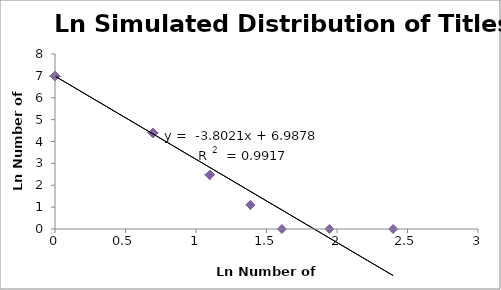
| Category | LnSimulated Number of Athletes |
|---|---|
| 2.3978952727983707 | 0 |
| 1.9459101490553132 | 0 |
| 1.6094379124341003 | 0 |
| 1.3862943611198906 | 1.099 |
| 1.3862943611198906 | 1.099 |
| 1.3862943611198906 | 1.099 |
| 1.0986122886681098 | 2.485 |
| 1.0986122886681098 | 2.485 |
| 1.0986122886681098 | 2.485 |
| 1.0986122886681098 | 2.485 |
| 1.0986122886681098 | 2.485 |
| 1.0986122886681098 | 2.485 |
| 1.0986122886681098 | 2.485 |
| 1.0986122886681098 | 2.485 |
| 1.0986122886681098 | 2.485 |
| 1.0986122886681098 | 2.485 |
| 1.0986122886681098 | 2.485 |
| 1.0986122886681098 | 2.485 |
| 0.6931471805599453 | 4.394 |
| 0.6931471805599453 | 4.394 |
| 0.6931471805599453 | 4.394 |
| 0.6931471805599453 | 4.394 |
| 0.6931471805599453 | 4.394 |
| 0.6931471805599453 | 4.394 |
| 0.6931471805599453 | 4.394 |
| 0.6931471805599453 | 4.394 |
| 0.6931471805599453 | 4.394 |
| 0.6931471805599453 | 4.394 |
| 0.6931471805599453 | 4.394 |
| 0.6931471805599453 | 4.394 |
| 0.6931471805599453 | 4.394 |
| 0.6931471805599453 | 4.394 |
| 0.6931471805599453 | 4.394 |
| 0.6931471805599453 | 4.394 |
| 0.6931471805599453 | 4.394 |
| 0.6931471805599453 | 4.394 |
| 0.6931471805599453 | 4.394 |
| 0.6931471805599453 | 4.394 |
| 0.6931471805599453 | 4.394 |
| 0.6931471805599453 | 4.394 |
| 0.6931471805599453 | 4.394 |
| 0.6931471805599453 | 4.394 |
| 0.6931471805599453 | 4.394 |
| 0.6931471805599453 | 4.394 |
| 0.6931471805599453 | 4.394 |
| 0.6931471805599453 | 4.394 |
| 0.6931471805599453 | 4.394 |
| 0.6931471805599453 | 4.394 |
| 0.6931471805599453 | 4.394 |
| 0.6931471805599453 | 4.394 |
| 0.6931471805599453 | 4.394 |
| 0.6931471805599453 | 4.394 |
| 0.6931471805599453 | 4.394 |
| 0.6931471805599453 | 4.394 |
| 0.6931471805599453 | 4.394 |
| 0.6931471805599453 | 4.394 |
| 0.6931471805599453 | 4.394 |
| 0.6931471805599453 | 4.394 |
| 0.6931471805599453 | 4.394 |
| 0.6931471805599453 | 4.394 |
| 0.6931471805599453 | 4.394 |
| 0.6931471805599453 | 4.394 |
| 0.6931471805599453 | 4.394 |
| 0.6931471805599453 | 4.394 |
| 0.6931471805599453 | 4.394 |
| 0.6931471805599453 | 4.394 |
| 0.6931471805599453 | 4.394 |
| 0.6931471805599453 | 4.394 |
| 0.6931471805599453 | 4.394 |
| 0.6931471805599453 | 4.394 |
| 0.6931471805599453 | 4.394 |
| 0.6931471805599453 | 4.394 |
| 0.6931471805599453 | 4.394 |
| 0.6931471805599453 | 4.394 |
| 0.6931471805599453 | 4.394 |
| 0.6931471805599453 | 4.394 |
| 0.6931471805599453 | 4.394 |
| 0.6931471805599453 | 4.394 |
| 0.6931471805599453 | 4.394 |
| 0.6931471805599453 | 4.394 |
| 0.6931471805599453 | 4.394 |
| 0.6931471805599453 | 4.394 |
| 0.6931471805599453 | 4.394 |
| 0.6931471805599453 | 4.394 |
| 0.6931471805599453 | 4.394 |
| 0.6931471805599453 | 4.394 |
| 0.6931471805599453 | 4.394 |
| 0.6931471805599453 | 4.394 |
| 0.6931471805599453 | 4.394 |
| 0.6931471805599453 | 4.394 |
| 0.6931471805599453 | 4.394 |
| 0.6931471805599453 | 4.394 |
| 0.6931471805599453 | 4.394 |
| 0.6931471805599453 | 4.394 |
| 0.6931471805599453 | 4.394 |
| 0.6931471805599453 | 4.394 |
| 0.6931471805599453 | 4.394 |
| 0.6931471805599453 | 4.394 |
| 0.6931471805599453 | 4.394 |
| 0.0 | 6.988 |
| 0.0 | 6.988 |
| 0.0 | 6.988 |
| 0.0 | 6.988 |
| 0.0 | 6.988 |
| 0.0 | 6.988 |
| 0.0 | 6.988 |
| 0.0 | 6.988 |
| 0.0 | 6.988 |
| 0.0 | 6.988 |
| 0.0 | 6.988 |
| 0.0 | 6.988 |
| 0.0 | 6.988 |
| 0.0 | 6.988 |
| 0.0 | 6.988 |
| 0.0 | 6.988 |
| 0.0 | 6.988 |
| 0.0 | 6.988 |
| 0.0 | 6.988 |
| 0.0 | 6.988 |
| 0.0 | 6.988 |
| 0.0 | 6.988 |
| 0.0 | 6.988 |
| 0.0 | 6.988 |
| 0.0 | 6.988 |
| 0.0 | 6.988 |
| 0.0 | 6.988 |
| 0.0 | 6.988 |
| 0.0 | 6.988 |
| 0.0 | 6.988 |
| 0.0 | 6.988 |
| 0.0 | 6.988 |
| 0.0 | 6.988 |
| 0.0 | 6.988 |
| 0.0 | 6.988 |
| 0.0 | 6.988 |
| 0.0 | 6.988 |
| 0.0 | 6.988 |
| 0.0 | 6.988 |
| 0.0 | 6.988 |
| 0.0 | 6.988 |
| 0.0 | 6.988 |
| 0.0 | 6.988 |
| 0.0 | 6.988 |
| 0.0 | 6.988 |
| 0.0 | 6.988 |
| 0.0 | 6.988 |
| 0.0 | 6.988 |
| 0.0 | 6.988 |
| 0.0 | 6.988 |
| 0.0 | 6.988 |
| 0.0 | 6.988 |
| 0.0 | 6.988 |
| 0.0 | 6.988 |
| 0.0 | 6.988 |
| 0.0 | 6.988 |
| 0.0 | 6.988 |
| 0.0 | 6.988 |
| 0.0 | 6.988 |
| 0.0 | 6.988 |
| 0.0 | 6.988 |
| 0.0 | 6.988 |
| 0.0 | 6.988 |
| 0.0 | 6.988 |
| 0.0 | 6.988 |
| 0.0 | 6.988 |
| 0.0 | 6.988 |
| 0.0 | 6.988 |
| 0.0 | 6.988 |
| 0.0 | 6.988 |
| 0.0 | 6.988 |
| 0.0 | 6.988 |
| 0.0 | 6.988 |
| 0.0 | 6.988 |
| 0.0 | 6.988 |
| 0.0 | 6.988 |
| 0.0 | 6.988 |
| 0.0 | 6.988 |
| 0.0 | 6.988 |
| 0.0 | 6.988 |
| 0.0 | 6.988 |
| 0.0 | 6.988 |
| 0.0 | 6.988 |
| 0.0 | 6.988 |
| 0.0 | 6.988 |
| 0.0 | 6.988 |
| 0.0 | 6.988 |
| 0.0 | 6.988 |
| 0.0 | 6.988 |
| 0.0 | 6.988 |
| 0.0 | 6.988 |
| 0.0 | 6.988 |
| 0.0 | 6.988 |
| 0.0 | 6.988 |
| 0.0 | 6.988 |
| 0.0 | 6.988 |
| 0.0 | 6.988 |
| 0.0 | 6.988 |
| 0.0 | 6.988 |
| 0.0 | 6.988 |
| 0.0 | 6.988 |
| 0.0 | 6.988 |
| 0.0 | 6.988 |
| 0.0 | 6.988 |
| 0.0 | 6.988 |
| 0.0 | 6.988 |
| 0.0 | 6.988 |
| 0.0 | 6.988 |
| 0.0 | 6.988 |
| 0.0 | 6.988 |
| 0.0 | 6.988 |
| 0.0 | 6.988 |
| 0.0 | 6.988 |
| 0.0 | 6.988 |
| 0.0 | 6.988 |
| 0.0 | 6.988 |
| 0.0 | 6.988 |
| 0.0 | 6.988 |
| 0.0 | 6.988 |
| 0.0 | 6.988 |
| 0.0 | 6.988 |
| 0.0 | 6.988 |
| 0.0 | 6.988 |
| 0.0 | 6.988 |
| 0.0 | 6.988 |
| 0.0 | 6.988 |
| 0.0 | 6.988 |
| 0.0 | 6.988 |
| 0.0 | 6.988 |
| 0.0 | 6.988 |
| 0.0 | 6.988 |
| 0.0 | 6.988 |
| 0.0 | 6.988 |
| 0.0 | 6.988 |
| 0.0 | 6.988 |
| 0.0 | 6.988 |
| 0.0 | 6.988 |
| 0.0 | 6.988 |
| 0.0 | 6.988 |
| 0.0 | 6.988 |
| 0.0 | 6.988 |
| 0.0 | 6.988 |
| 0.0 | 6.988 |
| 0.0 | 6.988 |
| 0.0 | 6.988 |
| 0.0 | 6.988 |
| 0.0 | 6.988 |
| 0.0 | 6.988 |
| 0.0 | 6.988 |
| 0.0 | 6.988 |
| 0.0 | 6.988 |
| 0.0 | 6.988 |
| 0.0 | 6.988 |
| 0.0 | 6.988 |
| 0.0 | 6.988 |
| 0.0 | 6.988 |
| 0.0 | 6.988 |
| 0.0 | 6.988 |
| 0.0 | 6.988 |
| 0.0 | 6.988 |
| 0.0 | 6.988 |
| 0.0 | 6.988 |
| 0.0 | 6.988 |
| 0.0 | 6.988 |
| 0.0 | 6.988 |
| 0.0 | 6.988 |
| 0.0 | 6.988 |
| 0.0 | 6.988 |
| 0.0 | 6.988 |
| 0.0 | 6.988 |
| 0.0 | 6.988 |
| 0.0 | 6.988 |
| 0.0 | 6.988 |
| 0.0 | 6.988 |
| 0.0 | 6.988 |
| 0.0 | 6.988 |
| 0.0 | 6.988 |
| 0.0 | 6.988 |
| 0.0 | 6.988 |
| 0.0 | 6.988 |
| 0.0 | 6.988 |
| 0.0 | 6.988 |
| 0.0 | 6.988 |
| 0.0 | 6.988 |
| 0.0 | 6.988 |
| 0.0 | 6.988 |
| 0.0 | 6.988 |
| 0.0 | 6.988 |
| 0.0 | 6.988 |
| 0.0 | 6.988 |
| 0.0 | 6.988 |
| 0.0 | 6.988 |
| 0.0 | 6.988 |
| 0.0 | 6.988 |
| 0.0 | 6.988 |
| 0.0 | 6.988 |
| 0.0 | 6.988 |
| 0.0 | 6.988 |
| 0.0 | 6.988 |
| 0.0 | 6.988 |
| 0.0 | 6.988 |
| 0.0 | 6.988 |
| 0.0 | 6.988 |
| 0.0 | 6.988 |
| 0.0 | 6.988 |
| 0.0 | 6.988 |
| 0.0 | 6.988 |
| 0.0 | 6.988 |
| 0.0 | 6.988 |
| 0.0 | 6.988 |
| 0.0 | 6.988 |
| 0.0 | 6.988 |
| 0.0 | 6.988 |
| 0.0 | 6.988 |
| 0.0 | 6.988 |
| 0.0 | 6.988 |
| 0.0 | 6.988 |
| 0.0 | 6.988 |
| 0.0 | 6.988 |
| 0.0 | 6.988 |
| 0.0 | 6.988 |
| 0.0 | 6.988 |
| 0.0 | 6.988 |
| 0.0 | 6.988 |
| 0.0 | 6.988 |
| 0.0 | 6.988 |
| 0.0 | 6.988 |
| 0.0 | 6.988 |
| 0.0 | 6.988 |
| 0.0 | 6.988 |
| 0.0 | 6.988 |
| 0.0 | 6.988 |
| 0.0 | 6.988 |
| 0.0 | 6.988 |
| 0.0 | 6.988 |
| 0.0 | 6.988 |
| 0.0 | 6.988 |
| 0.0 | 6.988 |
| 0.0 | 6.988 |
| 0.0 | 6.988 |
| 0.0 | 6.988 |
| 0.0 | 6.988 |
| 0.0 | 6.988 |
| 0.0 | 6.988 |
| 0.0 | 6.988 |
| 0.0 | 6.988 |
| 0.0 | 6.988 |
| 0.0 | 6.988 |
| 0.0 | 6.988 |
| 0.0 | 6.988 |
| 0.0 | 6.988 |
| 0.0 | 6.988 |
| 0.0 | 6.988 |
| 0.0 | 6.988 |
| 0.0 | 6.988 |
| 0.0 | 6.988 |
| 0.0 | 6.988 |
| 0.0 | 6.988 |
| 0.0 | 6.988 |
| 0.0 | 6.988 |
| 0.0 | 6.988 |
| 0.0 | 6.988 |
| 0.0 | 6.988 |
| 0.0 | 6.988 |
| 0.0 | 6.988 |
| 0.0 | 6.988 |
| 0.0 | 6.988 |
| 0.0 | 6.988 |
| 0.0 | 6.988 |
| 0.0 | 6.988 |
| 0.0 | 6.988 |
| 0.0 | 6.988 |
| 0.0 | 6.988 |
| 0.0 | 6.988 |
| 0.0 | 6.988 |
| 0.0 | 6.988 |
| 0.0 | 6.988 |
| 0.0 | 6.988 |
| 0.0 | 6.988 |
| 0.0 | 6.988 |
| 0.0 | 6.988 |
| 0.0 | 6.988 |
| 0.0 | 6.988 |
| 0.0 | 6.988 |
| 0.0 | 6.988 |
| 0.0 | 6.988 |
| 0.0 | 6.988 |
| 0.0 | 6.988 |
| 0.0 | 6.988 |
| 0.0 | 6.988 |
| 0.0 | 6.988 |
| 0.0 | 6.988 |
| 0.0 | 6.988 |
| 0.0 | 6.988 |
| 0.0 | 6.988 |
| 0.0 | 6.988 |
| 0.0 | 6.988 |
| 0.0 | 6.988 |
| 0.0 | 6.988 |
| 0.0 | 6.988 |
| 0.0 | 6.988 |
| 0.0 | 6.988 |
| 0.0 | 6.988 |
| 0.0 | 6.988 |
| 0.0 | 6.988 |
| 0.0 | 6.988 |
| 0.0 | 6.988 |
| 0.0 | 6.988 |
| 0.0 | 6.988 |
| 0.0 | 6.988 |
| 0.0 | 6.988 |
| 0.0 | 6.988 |
| 0.0 | 6.988 |
| 0.0 | 6.988 |
| 0.0 | 6.988 |
| 0.0 | 6.988 |
| 0.0 | 6.988 |
| 0.0 | 6.988 |
| 0.0 | 6.988 |
| 0.0 | 6.988 |
| 0.0 | 6.988 |
| 0.0 | 6.988 |
| 0.0 | 6.988 |
| 0.0 | 6.988 |
| 0.0 | 6.988 |
| 0.0 | 6.988 |
| 0.0 | 6.988 |
| 0.0 | 6.988 |
| 0.0 | 6.988 |
| 0.0 | 6.988 |
| 0.0 | 6.988 |
| 0.0 | 6.988 |
| 0.0 | 6.988 |
| 0.0 | 6.988 |
| 0.0 | 6.988 |
| 0.0 | 6.988 |
| 0.0 | 6.988 |
| 0.0 | 6.988 |
| 0.0 | 6.988 |
| 0.0 | 6.988 |
| 0.0 | 6.988 |
| 0.0 | 6.988 |
| 0.0 | 6.988 |
| 0.0 | 6.988 |
| 0.0 | 6.988 |
| 0.0 | 6.988 |
| 0.0 | 6.988 |
| 0.0 | 6.988 |
| 0.0 | 6.988 |
| 0.0 | 6.988 |
| 0.0 | 6.988 |
| 0.0 | 6.988 |
| 0.0 | 6.988 |
| 0.0 | 6.988 |
| 0.0 | 6.988 |
| 0.0 | 6.988 |
| 0.0 | 6.988 |
| 0.0 | 6.988 |
| 0.0 | 6.988 |
| 0.0 | 6.988 |
| 0.0 | 6.988 |
| 0.0 | 6.988 |
| 0.0 | 6.988 |
| 0.0 | 6.988 |
| 0.0 | 6.988 |
| 0.0 | 6.988 |
| 0.0 | 6.988 |
| 0.0 | 6.988 |
| 0.0 | 6.988 |
| 0.0 | 6.988 |
| 0.0 | 6.988 |
| 0.0 | 6.988 |
| 0.0 | 6.988 |
| 0.0 | 6.988 |
| 0.0 | 6.988 |
| 0.0 | 6.988 |
| 0.0 | 6.988 |
| 0.0 | 6.988 |
| 0.0 | 6.988 |
| 0.0 | 6.988 |
| 0.0 | 6.988 |
| 0.0 | 6.988 |
| 0.0 | 6.988 |
| 0.0 | 6.988 |
| 0.0 | 6.988 |
| 0.0 | 6.988 |
| 0.0 | 6.988 |
| 0.0 | 6.988 |
| 0.0 | 6.988 |
| 0.0 | 6.988 |
| 0.0 | 6.988 |
| 0.0 | 6.988 |
| 0.0 | 6.988 |
| 0.0 | 6.988 |
| 0.0 | 6.988 |
| 0.0 | 6.988 |
| 0.0 | 6.988 |
| 0.0 | 6.988 |
| 0.0 | 6.988 |
| 0.0 | 6.988 |
| 0.0 | 6.988 |
| 0.0 | 6.988 |
| 0.0 | 6.988 |
| 0.0 | 6.988 |
| 0.0 | 6.988 |
| 0.0 | 6.988 |
| 0.0 | 6.988 |
| 0.0 | 6.988 |
| 0.0 | 6.988 |
| 0.0 | 6.988 |
| 0.0 | 6.988 |
| 0.0 | 6.988 |
| 0.0 | 6.988 |
| 0.0 | 6.988 |
| 0.0 | 6.988 |
| 0.0 | 6.988 |
| 0.0 | 6.988 |
| 0.0 | 6.988 |
| 0.0 | 6.988 |
| 0.0 | 6.988 |
| 0.0 | 6.988 |
| 0.0 | 6.988 |
| 0.0 | 6.988 |
| 0.0 | 6.988 |
| 0.0 | 6.988 |
| 0.0 | 6.988 |
| 0.0 | 6.988 |
| 0.0 | 6.988 |
| 0.0 | 6.988 |
| 0.0 | 6.988 |
| 0.0 | 6.988 |
| 0.0 | 6.988 |
| 0.0 | 6.988 |
| 0.0 | 6.988 |
| 0.0 | 6.988 |
| 0.0 | 6.988 |
| 0.0 | 6.988 |
| 0.0 | 6.988 |
| 0.0 | 6.988 |
| 0.0 | 6.988 |
| 0.0 | 6.988 |
| 0.0 | 6.988 |
| 0.0 | 6.988 |
| 0.0 | 6.988 |
| 0.0 | 6.988 |
| 0.0 | 6.988 |
| 0.0 | 6.988 |
| 0.0 | 6.988 |
| 0.0 | 6.988 |
| 0.0 | 6.988 |
| 0.0 | 6.988 |
| 0.0 | 6.988 |
| 0.0 | 6.988 |
| 0.0 | 6.988 |
| 0.0 | 6.988 |
| 0.0 | 6.988 |
| 0.0 | 6.988 |
| 0.0 | 6.988 |
| 0.0 | 6.988 |
| 0.0 | 6.988 |
| 0.0 | 6.988 |
| 0.0 | 6.988 |
| 0.0 | 6.988 |
| 0.0 | 6.988 |
| 0.0 | 6.988 |
| 0.0 | 6.988 |
| 0.0 | 6.988 |
| 0.0 | 6.988 |
| 0.0 | 6.988 |
| 0.0 | 6.988 |
| 0.0 | 6.988 |
| 0.0 | 6.988 |
| 0.0 | 6.988 |
| 0.0 | 6.988 |
| 0.0 | 6.988 |
| 0.0 | 6.988 |
| 0.0 | 6.988 |
| 0.0 | 6.988 |
| 0.0 | 6.988 |
| 0.0 | 6.988 |
| 0.0 | 6.988 |
| 0.0 | 6.988 |
| 0.0 | 6.988 |
| 0.0 | 6.988 |
| 0.0 | 6.988 |
| 0.0 | 6.988 |
| 0.0 | 6.988 |
| 0.0 | 6.988 |
| 0.0 | 6.988 |
| 0.0 | 6.988 |
| 0.0 | 6.988 |
| 0.0 | 6.988 |
| 0.0 | 6.988 |
| 0.0 | 6.988 |
| 0.0 | 6.988 |
| 0.0 | 6.988 |
| 0.0 | 6.988 |
| 0.0 | 6.988 |
| 0.0 | 6.988 |
| 0.0 | 6.988 |
| 0.0 | 6.988 |
| 0.0 | 6.988 |
| 0.0 | 6.988 |
| 0.0 | 6.988 |
| 0.0 | 6.988 |
| 0.0 | 6.988 |
| 0.0 | 6.988 |
| 0.0 | 6.988 |
| 0.0 | 6.988 |
| 0.0 | 6.988 |
| 0.0 | 6.988 |
| 0.0 | 6.988 |
| 0.0 | 6.988 |
| 0.0 | 6.988 |
| 0.0 | 6.988 |
| 0.0 | 6.988 |
| 0.0 | 6.988 |
| 0.0 | 6.988 |
| 0.0 | 6.988 |
| 0.0 | 6.988 |
| 0.0 | 6.988 |
| 0.0 | 6.988 |
| 0.0 | 6.988 |
| 0.0 | 6.988 |
| 0.0 | 6.988 |
| 0.0 | 6.988 |
| 0.0 | 6.988 |
| 0.0 | 6.988 |
| 0.0 | 6.988 |
| 0.0 | 6.988 |
| 0.0 | 6.988 |
| 0.0 | 6.988 |
| 0.0 | 6.988 |
| 0.0 | 6.988 |
| 0.0 | 6.988 |
| 0.0 | 6.988 |
| 0.0 | 6.988 |
| 0.0 | 6.988 |
| 0.0 | 6.988 |
| 0.0 | 6.988 |
| 0.0 | 6.988 |
| 0.0 | 6.988 |
| 0.0 | 6.988 |
| 0.0 | 6.988 |
| 0.0 | 6.988 |
| 0.0 | 6.988 |
| 0.0 | 6.988 |
| 0.0 | 6.988 |
| 0.0 | 6.988 |
| 0.0 | 6.988 |
| 0.0 | 6.988 |
| 0.0 | 6.988 |
| 0.0 | 6.988 |
| 0.0 | 6.988 |
| 0.0 | 6.988 |
| 0.0 | 6.988 |
| 0.0 | 6.988 |
| 0.0 | 6.988 |
| 0.0 | 6.988 |
| 0.0 | 6.988 |
| 0.0 | 6.988 |
| 0.0 | 6.988 |
| 0.0 | 6.988 |
| 0.0 | 6.988 |
| 0.0 | 6.988 |
| 0.0 | 6.988 |
| 0.0 | 6.988 |
| 0.0 | 6.988 |
| 0.0 | 6.988 |
| 0.0 | 6.988 |
| 0.0 | 6.988 |
| 0.0 | 6.988 |
| 0.0 | 6.988 |
| 0.0 | 6.988 |
| 0.0 | 6.988 |
| 0.0 | 6.988 |
| 0.0 | 6.988 |
| 0.0 | 6.988 |
| 0.0 | 6.988 |
| 0.0 | 6.988 |
| 0.0 | 6.988 |
| 0.0 | 6.988 |
| 0.0 | 6.988 |
| 0.0 | 6.988 |
| 0.0 | 6.988 |
| 0.0 | 6.988 |
| 0.0 | 6.988 |
| 0.0 | 6.988 |
| 0.0 | 6.988 |
| 0.0 | 6.988 |
| 0.0 | 6.988 |
| 0.0 | 6.988 |
| 0.0 | 6.988 |
| 0.0 | 6.988 |
| 0.0 | 6.988 |
| 0.0 | 6.988 |
| 0.0 | 6.988 |
| 0.0 | 6.988 |
| 0.0 | 6.988 |
| 0.0 | 6.988 |
| 0.0 | 6.988 |
| 0.0 | 6.988 |
| 0.0 | 6.988 |
| 0.0 | 6.988 |
| 0.0 | 6.988 |
| 0.0 | 6.988 |
| 0.0 | 6.988 |
| 0.0 | 6.988 |
| 0.0 | 6.988 |
| 0.0 | 6.988 |
| 0.0 | 6.988 |
| 0.0 | 6.988 |
| 0.0 | 6.988 |
| 0.0 | 6.988 |
| 0.0 | 6.988 |
| 0.0 | 6.988 |
| 0.0 | 6.988 |
| 0.0 | 6.988 |
| 0.0 | 6.988 |
| 0.0 | 6.988 |
| 0.0 | 6.988 |
| 0.0 | 6.988 |
| 0.0 | 6.988 |
| 0.0 | 6.988 |
| 0.0 | 6.988 |
| 0.0 | 6.988 |
| 0.0 | 6.988 |
| 0.0 | 6.988 |
| 0.0 | 6.988 |
| 0.0 | 6.988 |
| 0.0 | 6.988 |
| 0.0 | 6.988 |
| 0.0 | 6.988 |
| 0.0 | 6.988 |
| 0.0 | 6.988 |
| 0.0 | 6.988 |
| 0.0 | 6.988 |
| 0.0 | 6.988 |
| 0.0 | 6.988 |
| 0.0 | 6.988 |
| 0.0 | 6.988 |
| 0.0 | 6.988 |
| 0.0 | 6.988 |
| 0.0 | 6.988 |
| 0.0 | 6.988 |
| 0.0 | 6.988 |
| 0.0 | 6.988 |
| 0.0 | 6.988 |
| 0.0 | 6.988 |
| 0.0 | 6.988 |
| 0.0 | 6.988 |
| 0.0 | 6.988 |
| 0.0 | 6.988 |
| 0.0 | 6.988 |
| 0.0 | 6.988 |
| 0.0 | 6.988 |
| 0.0 | 6.988 |
| 0.0 | 6.988 |
| 0.0 | 6.988 |
| 0.0 | 6.988 |
| 0.0 | 6.988 |
| 0.0 | 6.988 |
| 0.0 | 6.988 |
| 0.0 | 6.988 |
| 0.0 | 6.988 |
| 0.0 | 6.988 |
| 0.0 | 6.988 |
| 0.0 | 6.988 |
| 0.0 | 6.988 |
| 0.0 | 6.988 |
| 0.0 | 6.988 |
| 0.0 | 6.988 |
| 0.0 | 6.988 |
| 0.0 | 6.988 |
| 0.0 | 6.988 |
| 0.0 | 6.988 |
| 0.0 | 6.988 |
| 0.0 | 6.988 |
| 0.0 | 6.988 |
| 0.0 | 6.988 |
| 0.0 | 6.988 |
| 0.0 | 6.988 |
| 0.0 | 6.988 |
| 0.0 | 6.988 |
| 0.0 | 6.988 |
| 0.0 | 6.988 |
| 0.0 | 6.988 |
| 0.0 | 6.988 |
| 0.0 | 6.988 |
| 0.0 | 6.988 |
| 0.0 | 6.988 |
| 0.0 | 6.988 |
| 0.0 | 6.988 |
| 0.0 | 6.988 |
| 0.0 | 6.988 |
| 0.0 | 6.988 |
| 0.0 | 6.988 |
| 0.0 | 6.988 |
| 0.0 | 6.988 |
| 0.0 | 6.988 |
| 0.0 | 6.988 |
| 0.0 | 6.988 |
| 0.0 | 6.988 |
| 0.0 | 6.988 |
| 0.0 | 6.988 |
| 0.0 | 6.988 |
| 0.0 | 6.988 |
| 0.0 | 6.988 |
| 0.0 | 6.988 |
| 0.0 | 6.988 |
| 0.0 | 6.988 |
| 0.0 | 6.988 |
| 0.0 | 6.988 |
| 0.0 | 6.988 |
| 0.0 | 6.988 |
| 0.0 | 6.988 |
| 0.0 | 6.988 |
| 0.0 | 6.988 |
| 0.0 | 6.988 |
| 0.0 | 6.988 |
| 0.0 | 6.988 |
| 0.0 | 6.988 |
| 0.0 | 6.988 |
| 0.0 | 6.988 |
| 0.0 | 6.988 |
| 0.0 | 6.988 |
| 0.0 | 6.988 |
| 0.0 | 6.988 |
| 0.0 | 6.988 |
| 0.0 | 6.988 |
| 0.0 | 6.988 |
| 0.0 | 6.988 |
| 0.0 | 6.988 |
| 0.0 | 6.988 |
| 0.0 | 6.988 |
| 0.0 | 6.988 |
| 0.0 | 6.988 |
| 0.0 | 6.988 |
| 0.0 | 6.988 |
| 0.0 | 6.988 |
| 0.0 | 6.988 |
| 0.0 | 6.988 |
| 0.0 | 6.988 |
| 0.0 | 6.988 |
| 0.0 | 6.988 |
| 0.0 | 6.988 |
| 0.0 | 6.988 |
| 0.0 | 6.988 |
| 0.0 | 6.988 |
| 0.0 | 6.988 |
| 0.0 | 6.988 |
| 0.0 | 6.988 |
| 0.0 | 6.988 |
| 0.0 | 6.988 |
| 0.0 | 6.988 |
| 0.0 | 6.988 |
| 0.0 | 6.988 |
| 0.0 | 6.988 |
| 0.0 | 6.988 |
| 0.0 | 6.988 |
| 0.0 | 6.988 |
| 0.0 | 6.988 |
| 0.0 | 6.988 |
| 0.0 | 6.988 |
| 0.0 | 6.988 |
| 0.0 | 6.988 |
| 0.0 | 6.988 |
| 0.0 | 6.988 |
| 0.0 | 6.988 |
| 0.0 | 6.988 |
| 0.0 | 6.988 |
| 0.0 | 6.988 |
| 0.0 | 6.988 |
| 0.0 | 6.988 |
| 0.0 | 6.988 |
| 0.0 | 6.988 |
| 0.0 | 6.988 |
| 0.0 | 6.988 |
| 0.0 | 6.988 |
| 0.0 | 6.988 |
| 0.0 | 6.988 |
| 0.0 | 6.988 |
| 0.0 | 6.988 |
| 0.0 | 6.988 |
| 0.0 | 6.988 |
| 0.0 | 6.988 |
| 0.0 | 6.988 |
| 0.0 | 6.988 |
| 0.0 | 6.988 |
| 0.0 | 6.988 |
| 0.0 | 6.988 |
| 0.0 | 6.988 |
| 0.0 | 6.988 |
| 0.0 | 6.988 |
| 0.0 | 6.988 |
| 0.0 | 6.988 |
| 0.0 | 6.988 |
| 0.0 | 6.988 |
| 0.0 | 6.988 |
| 0.0 | 6.988 |
| 0.0 | 6.988 |
| 0.0 | 6.988 |
| 0.0 | 6.988 |
| 0.0 | 6.988 |
| 0.0 | 6.988 |
| 0.0 | 6.988 |
| 0.0 | 6.988 |
| 0.0 | 6.988 |
| 0.0 | 6.988 |
| 0.0 | 6.988 |
| 0.0 | 6.988 |
| 0.0 | 6.988 |
| 0.0 | 6.988 |
| 0.0 | 6.988 |
| 0.0 | 6.988 |
| 0.0 | 6.988 |
| 0.0 | 6.988 |
| 0.0 | 6.988 |
| 0.0 | 6.988 |
| 0.0 | 6.988 |
| 0.0 | 6.988 |
| 0.0 | 6.988 |
| 0.0 | 6.988 |
| 0.0 | 6.988 |
| 0.0 | 6.988 |
| 0.0 | 6.988 |
| 0.0 | 6.988 |
| 0.0 | 6.988 |
| 0.0 | 6.988 |
| 0.0 | 6.988 |
| 0.0 | 6.988 |
| 0.0 | 6.988 |
| 0.0 | 6.988 |
| 0.0 | 6.988 |
| 0.0 | 6.988 |
| 0.0 | 6.988 |
| 0.0 | 6.988 |
| 0.0 | 6.988 |
| 0.0 | 6.988 |
| 0.0 | 6.988 |
| 0.0 | 6.988 |
| 0.0 | 6.988 |
| 0.0 | 6.988 |
| 0.0 | 6.988 |
| 0.0 | 6.988 |
| 0.0 | 6.988 |
| 0.0 | 6.988 |
| 0.0 | 6.988 |
| 0.0 | 6.988 |
| 0.0 | 6.988 |
| 0.0 | 6.988 |
| 0.0 | 6.988 |
| 0.0 | 6.988 |
| 0.0 | 6.988 |
| 0.0 | 6.988 |
| 0.0 | 6.988 |
| 0.0 | 6.988 |
| 0.0 | 6.988 |
| 0.0 | 6.988 |
| 0.0 | 6.988 |
| 0.0 | 6.988 |
| 0.0 | 6.988 |
| 0.0 | 6.988 |
| 0.0 | 6.988 |
| 0.0 | 6.988 |
| 0.0 | 6.988 |
| 0.0 | 6.988 |
| 0.0 | 6.988 |
| 0.0 | 6.988 |
| 0.0 | 6.988 |
| 0.0 | 6.988 |
| 0.0 | 6.988 |
| 0.0 | 6.988 |
| 0.0 | 6.988 |
| 0.0 | 6.988 |
| 0.0 | 6.988 |
| 0.0 | 6.988 |
| 0.0 | 6.988 |
| 0.0 | 6.988 |
| 0.0 | 6.988 |
| 0.0 | 6.988 |
| 0.0 | 6.988 |
| 0.0 | 6.988 |
| 0.0 | 6.988 |
| 0.0 | 6.988 |
| 0.0 | 6.988 |
| 0.0 | 6.988 |
| 0.0 | 6.988 |
| 0.0 | 6.988 |
| 0.0 | 6.988 |
| 0.0 | 6.988 |
| 0.0 | 6.988 |
| 0.0 | 6.988 |
| 0.0 | 6.988 |
| 0.0 | 6.988 |
| 0.0 | 6.988 |
| 0.0 | 6.988 |
| 0.0 | 6.988 |
| 0.0 | 6.988 |
| 0.0 | 6.988 |
| 0.0 | 6.988 |
| 0.0 | 6.988 |
| 0.0 | 6.988 |
| 0.0 | 6.988 |
| 0.0 | 6.988 |
| 0.0 | 6.988 |
| 0.0 | 6.988 |
| 0.0 | 6.988 |
| 0.0 | 6.988 |
| 0.0 | 6.988 |
| 0.0 | 6.988 |
| 0.0 | 6.988 |
| 0.0 | 6.988 |
| 0.0 | 6.988 |
| 0.0 | 6.988 |
| 0.0 | 6.988 |
| 0.0 | 6.988 |
| 0.0 | 6.988 |
| 0.0 | 6.988 |
| 0.0 | 6.988 |
| 0.0 | 6.988 |
| 0.0 | 6.988 |
| 0.0 | 6.988 |
| 0.0 | 6.988 |
| 0.0 | 6.988 |
| 0.0 | 6.988 |
| 0.0 | 6.988 |
| 0.0 | 6.988 |
| 0.0 | 6.988 |
| 0.0 | 6.988 |
| 0.0 | 6.988 |
| 0.0 | 6.988 |
| 0.0 | 6.988 |
| 0.0 | 6.988 |
| 0.0 | 6.988 |
| 0.0 | 6.988 |
| 0.0 | 6.988 |
| 0.0 | 6.988 |
| 0.0 | 6.988 |
| 0.0 | 6.988 |
| 0.0 | 6.988 |
| 0.0 | 6.988 |
| 0.0 | 6.988 |
| 0.0 | 6.988 |
| 0.0 | 6.988 |
| 0.0 | 6.988 |
| 0.0 | 6.988 |
| 0.0 | 6.988 |
| 0.0 | 6.988 |
| 0.0 | 6.988 |
| 0.0 | 6.988 |
| 0.0 | 6.988 |
| 0.0 | 6.988 |
| 0.0 | 6.988 |
| 0.0 | 6.988 |
| 0.0 | 6.988 |
| 0.0 | 6.988 |
| 0.0 | 6.988 |
| 0.0 | 6.988 |
| 0.0 | 6.988 |
| 0.0 | 6.988 |
| 0.0 | 6.988 |
| 0.0 | 6.988 |
| 0.0 | 6.988 |
| 0.0 | 6.988 |
| 0.0 | 6.988 |
| 0.0 | 6.988 |
| 0.0 | 6.988 |
| 0.0 | 6.988 |
| 0.0 | 6.988 |
| 0.0 | 6.988 |
| 0.0 | 6.988 |
| 0.0 | 6.988 |
| 0.0 | 6.988 |
| 0.0 | 6.988 |
| 0.0 | 6.988 |
| 0.0 | 6.988 |
| 0.0 | 6.988 |
| 0.0 | 6.988 |
| 0.0 | 6.988 |
| 0.0 | 6.988 |
| 0.0 | 6.988 |
| 0.0 | 6.988 |
| 0.0 | 6.988 |
| 0.0 | 6.988 |
| 0.0 | 6.988 |
| 0.0 | 6.988 |
| 0.0 | 6.988 |
| 0.0 | 6.988 |
| 0.0 | 6.988 |
| 0.0 | 6.988 |
| 0.0 | 6.988 |
| 0.0 | 6.988 |
| 0.0 | 6.988 |
| 0.0 | 6.988 |
| 0.0 | 6.988 |
| 0.0 | 6.988 |
| 0.0 | 6.988 |
| 0.0 | 6.988 |
| 0.0 | 6.988 |
| 0.0 | 6.988 |
| 0.0 | 6.988 |
| 0.0 | 6.988 |
| 0.0 | 6.988 |
| 0.0 | 6.988 |
| 0.0 | 6.988 |
| 0.0 | 6.988 |
| 0.0 | 6.988 |
| 0.0 | 6.988 |
| 0.0 | 6.988 |
| 0.0 | 6.988 |
| 0.0 | 6.988 |
| 0.0 | 6.988 |
| 0.0 | 6.988 |
| 0.0 | 6.988 |
| 0.0 | 6.988 |
| 0.0 | 6.988 |
| 0.0 | 6.988 |
| 0.0 | 6.988 |
| 0.0 | 6.988 |
| 0.0 | 6.988 |
| 0.0 | 6.988 |
| 0.0 | 6.988 |
| 0.0 | 6.988 |
| 0.0 | 6.988 |
| 0.0 | 6.988 |
| 0.0 | 6.988 |
| 0.0 | 6.988 |
| 0.0 | 6.988 |
| 0.0 | 6.988 |
| 0.0 | 6.988 |
| 0.0 | 6.988 |
| 0.0 | 6.988 |
| 0.0 | 6.988 |
| 0.0 | 6.988 |
| 0.0 | 6.988 |
| 0.0 | 6.988 |
| 0.0 | 6.988 |
| 0.0 | 6.988 |
| 0.0 | 6.988 |
| 0.0 | 6.988 |
| 0.0 | 6.988 |
| 0.0 | 6.988 |
| 0.0 | 6.988 |
| 0.0 | 6.988 |
| 0.0 | 6.988 |
| 0.0 | 6.988 |
| 0.0 | 6.988 |
| 0.0 | 6.988 |
| 0.0 | 6.988 |
| 0.0 | 6.988 |
| 0.0 | 6.988 |
| 0.0 | 6.988 |
| 0.0 | 6.988 |
| 0.0 | 6.988 |
| 0.0 | 6.988 |
| 0.0 | 6.988 |
| 0.0 | 6.988 |
| 0.0 | 6.988 |
| 0.0 | 6.988 |
| 0.0 | 6.988 |
| 0.0 | 6.988 |
| 0.0 | 6.988 |
| 0.0 | 6.988 |
| 0.0 | 6.988 |
| 0.0 | 6.988 |
| 0.0 | 6.988 |
| 0.0 | 6.988 |
| 0.0 | 6.988 |
| 0.0 | 6.988 |
| 0.0 | 6.988 |
| 0.0 | 6.988 |
| 0.0 | 6.988 |
| 0.0 | 6.988 |
| 0.0 | 6.988 |
| 0.0 | 6.988 |
| 0.0 | 6.988 |
| 0.0 | 6.988 |
| 0.0 | 6.988 |
| 0.0 | 6.988 |
| 0.0 | 6.988 |
| 0.0 | 6.988 |
| 0.0 | 6.988 |
| 0.0 | 6.988 |